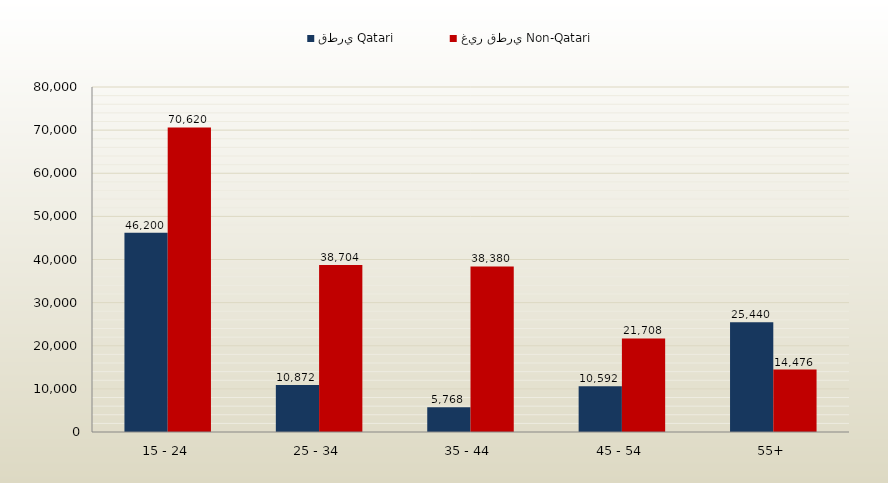
| Category | قطري Qatari | غير قطري Non-Qatari |
|---|---|---|
| 15 - 24 | 46200 | 70620 |
| 25 - 34 | 10872 | 38704 |
| 35 - 44 | 5768 | 38380 |
| 45 - 54 | 10592 | 21708 |
| 55+ | 25440 | 14476 |